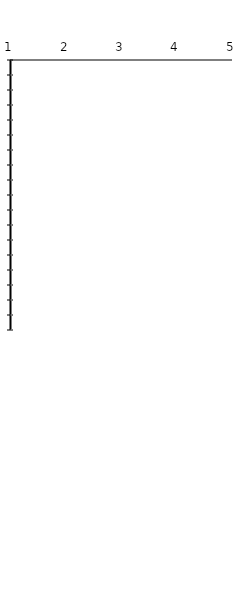
| Category | Series 0 |
|---|---|
| 0 | 0 |
| 1 | 0 |
| 2 | 0 |
| 3 | 0 |
| 4 | 0 |
| 5 | 0 |
| 6 | 0 |
| 7 | 0 |
| 8 | 0 |
| 9 | 0 |
| 10 | 0 |
| 11 | 0 |
| 12 | 0 |
| 13 | 0 |
| 14 | 0 |
| 15 | 0 |
| 16 | 0 |
| 17 | 0 |